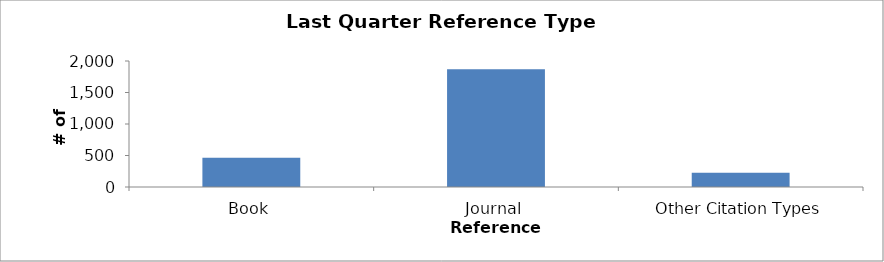
| Category | Series 0 |
|---|---|
| Book | 466 |
| Journal | 1868 |
| Other Citation Types | 225 |